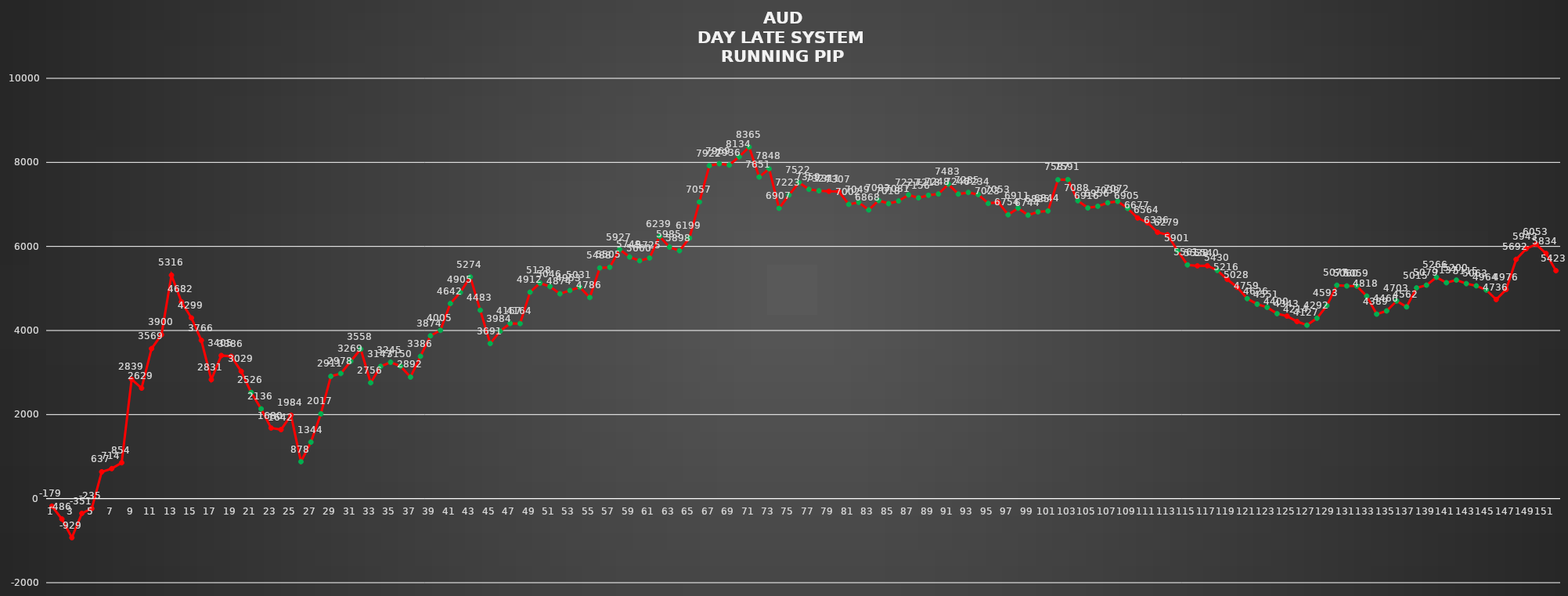
| Category | Series 0 |
|---|---|
| 0 | -179 |
| 1 | -486 |
| 2 | -929 |
| 3 | -351 |
| 4 | -235 |
| 5 | 637 |
| 6 | 714 |
| 7 | 854 |
| 8 | 2839 |
| 9 | 2629 |
| 10 | 3569 |
| 11 | 3900 |
| 12 | 5316 |
| 13 | 4682 |
| 14 | 4299 |
| 15 | 3766 |
| 16 | 2831 |
| 17 | 3405 |
| 18 | 3386 |
| 19 | 3029 |
| 20 | 2526 |
| 21 | 2136 |
| 22 | 1680 |
| 23 | 1642 |
| 24 | 1984 |
| 25 | 878 |
| 26 | 1344 |
| 27 | 2017 |
| 28 | 2911 |
| 29 | 2978 |
| 30 | 3269 |
| 31 | 3558 |
| 32 | 2756 |
| 33 | 3147 |
| 34 | 3245 |
| 35 | 3150 |
| 36 | 2892 |
| 37 | 3386 |
| 38 | 3874 |
| 39 | 4005 |
| 40 | 4642 |
| 41 | 4905 |
| 42 | 5274 |
| 43 | 4483 |
| 44 | 3691 |
| 45 | 3984 |
| 46 | 4167 |
| 47 | 4164 |
| 48 | 4912 |
| 49 | 5128 |
| 50 | 5046 |
| 51 | 4874 |
| 52 | 4953 |
| 53 | 5031 |
| 54 | 4786 |
| 55 | 5488 |
| 56 | 5505 |
| 57 | 5927 |
| 58 | 5749 |
| 59 | 5660 |
| 60 | 5725 |
| 61 | 6239 |
| 62 | 5985 |
| 63 | 5898 |
| 64 | 6199 |
| 65 | 7057 |
| 66 | 7922 |
| 67 | 7969 |
| 68 | 7936 |
| 69 | 8134 |
| 70 | 8365 |
| 71 | 7651 |
| 72 | 7848 |
| 73 | 6907 |
| 74 | 7223 |
| 75 | 7522 |
| 76 | 7359 |
| 77 | 7324 |
| 78 | 7311 |
| 79 | 7307 |
| 80 | 7002 |
| 81 | 7049 |
| 82 | 6868 |
| 83 | 7093 |
| 84 | 7018 |
| 85 | 7081 |
| 86 | 7227 |
| 87 | 7156 |
| 88 | 7218 |
| 89 | 7248 |
| 90 | 7483 |
| 91 | 7246 |
| 92 | 7285 |
| 93 | 7234 |
| 94 | 7023 |
| 95 | 7053 |
| 96 | 6754 |
| 97 | 6911 |
| 98 | 6744 |
| 99 | 6825 |
| 100 | 6844 |
| 101 | 7587 |
| 102 | 7591 |
| 103 | 7088 |
| 104 | 6916 |
| 105 | 6956 |
| 106 | 7038 |
| 107 | 7072 |
| 108 | 6905 |
| 109 | 6677 |
| 110 | 6564 |
| 111 | 6336 |
| 112 | 6279 |
| 113 | 5901 |
| 114 | 5561 |
| 115 | 5538 |
| 116 | 5540 |
| 117 | 5430 |
| 118 | 5216 |
| 119 | 5028 |
| 120 | 4759 |
| 121 | 4626 |
| 122 | 4551 |
| 123 | 4400 |
| 124 | 4343 |
| 125 | 4214 |
| 126 | 4127 |
| 127 | 4292 |
| 128 | 4593 |
| 129 | 5077 |
| 130 | 5060 |
| 131 | 5059 |
| 132 | 4818 |
| 133 | 4389 |
| 134 | 4466 |
| 135 | 4703 |
| 136 | 4562 |
| 137 | 5015 |
| 138 | 5079 |
| 139 | 5266 |
| 140 | 5137 |
| 141 | 5200 |
| 142 | 5115 |
| 143 | 5063 |
| 144 | 4964 |
| 145 | 4736 |
| 146 | 4976 |
| 147 | 5692 |
| 148 | 5943 |
| 149 | 6053 |
| 150 | 5834 |
| 151 | 5423 |